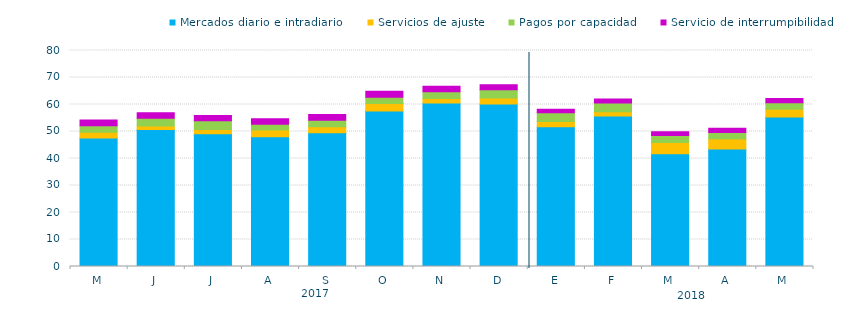
| Category | Mercados diario e intradiario  | Servicios de ajuste | Pagos por capacidad | Servicio de interrumpibilidad |
|---|---|---|---|---|
| M | 47.6 | 2.13 | 2.37 | 2.15 |
| J | 50.77 | 1.25 | 2.91 | 2 |
| J | 49.13 | 1.65 | 3.22 | 1.93 |
| A | 48.03 | 2.5 | 2.18 | 1.99 |
| S | 49.52 | 2.2 | 2.42 | 2.14 |
| O | 57.59 | 2.78 | 2.34 | 2.16 |
| N | 60.56 | 1.68 | 2.49 | 2.07 |
| D | 60.14 | 2.25 | 3.07 | 1.85 |
| E | 51.77 | 1.96 | 3.19 | 1.36 |
| F | 55.76 | 1.57 | 3.25 | 1.46 |
| M | 41.75 | 4.21 | 2.56 | 1.41 |
| A | 43.51 | 3.68 | 2.43 | 1.56 |
| M | 55.4 | 2.88 | 2.37 | 1.53 |